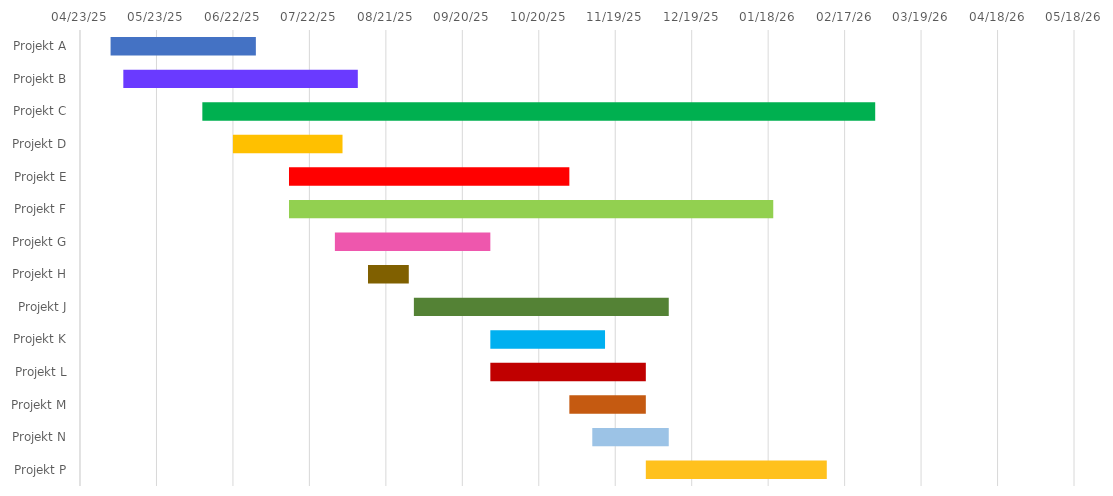
| Category | BEGINNEN | Dauer |
|---|---|---|
| Projekt A | 2025-05-05 | 57 |
| Projekt B | 2025-05-10 | 92 |
| Projekt C | 2025-06-10 | 264 |
| Projekt D | 2025-06-22 | 43 |
| Projekt E | 2025-07-14 | 110 |
| Projekt F | 2025-07-14 | 190 |
| Projekt G | 2025-08-01 | 61 |
| Projekt H | 2025-08-14 | 16 |
| Projekt J | 2025-09-01 | 100 |
| Projekt K | 2025-10-01 | 45 |
| Projekt L | 2025-10-01 | 61 |
| Projekt M | 2025-11-01 | 30 |
| Projekt N | 2025-11-10 | 30 |
| Projekt P | 2025-12-01 | 71 |